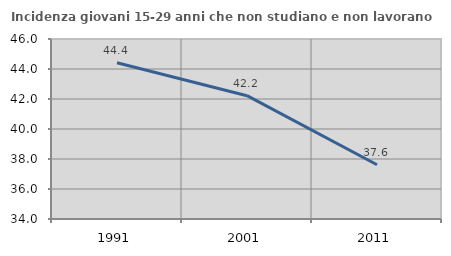
| Category | Incidenza giovani 15-29 anni che non studiano e non lavorano  |
|---|---|
| 1991.0 | 44.413 |
| 2001.0 | 42.221 |
| 2011.0 | 37.616 |